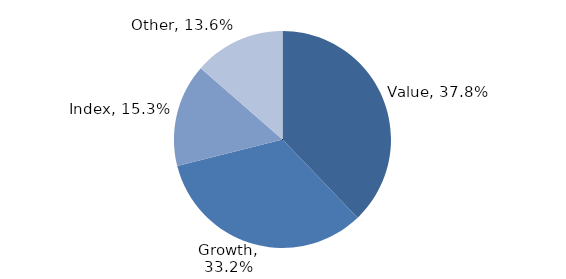
| Category | Investment Style |
|---|---|
| Value | 0.378 |
| Growth | 0.332 |
| Index | 0.153 |
| Other | 0.136 |